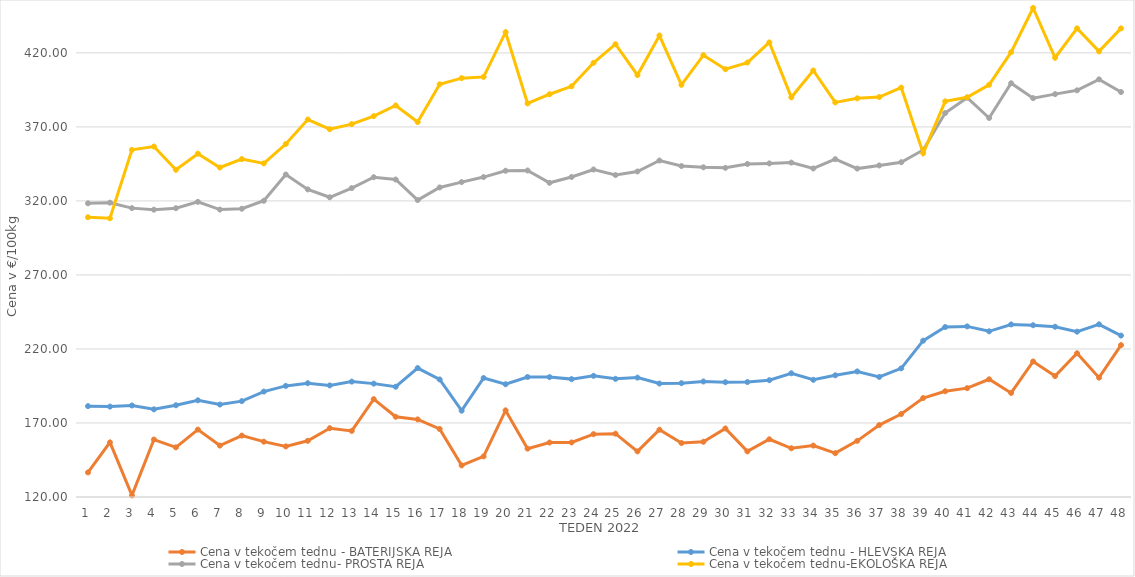
| Category | Cena v tekočem tednu - BATERIJSKA REJA | Cena v tekočem tednu - HLEVSKA REJA | Cena v tekočem tednu- PROSTA REJA | Cena v tekočem tednu-EKOLOŠKA REJA |
|---|---|---|---|---|
| 1.0 | 136.59 | 181.38 | 318.4 | 308.97 |
| 2.0 | 156.88 | 181.07 | 318.82 | 308.28 |
| 3.0 | 121.07 | 181.83 | 315.14 | 354.48 |
| 4.0 | 158.82 | 179.22 | 314.08 | 356.72 |
| 5.0 | 153.55 | 181.96 | 315.1 | 341.03 |
| 6.0 | 165.51 | 185.31 | 319.38 | 351.9 |
| 7.0 | 154.74 | 182.45 | 314.16 | 342.59 |
| 8.0 | 161.48 | 184.77 | 314.71 | 348.28 |
| 9.0 | 157.38 | 191.21 | 320.1 | 345.35 |
| 10.0 | 154.16 | 195.04 | 337.83 | 358.45 |
| 11.0 | 157.96 | 196.88 | 327.79 | 375 |
| 12.0 | 166.49 | 195.36 | 322.46 | 368.45 |
| 13.0 | 164.66 | 197.95 | 328.67 | 371.9 |
| 14.0 | 186.11 | 196.59 | 336.02 | 377.24 |
| 15.0 | 174.18 | 194.49 | 334.46 | 384.48 |
| 16.0 | 172.42 | 207.1 | 320.58 | 373.28 |
| 17.0 | 165.96 | 199.41 | 329.11 | 398.79 |
| 18.0 | 141.36 | 178.29 | 332.71 | 402.93 |
| 19.0 | 147.43 | 200.37 | 336.11 | 403.79 |
| 20.0 | 178.51 | 196.16 | 340.4 | 433.97 |
| 21.0 | 152.67 | 201.05 | 340.55 | 385.86 |
| 22.0 | 156.8 | 200.98 | 332.23 | 392.07 |
| 23.0 | 156.84 | 199.63 | 336.16 | 397.41 |
| 24.0 | 162.44 | 201.86 | 341.24 | 413.28 |
| 25.0 | 162.78 | 199.81 | 337.48 | 425.86 |
| 26.0 | 150.82 | 200.65 | 339.9 | 405 |
| 27.0 | 165.45 | 196.64 | 347.3 | 431.72 |
| 28.0 | 156.46 | 196.88 | 343.56 | 398.45 |
| 29.0 | 157.31 | 198.03 | 342.71 | 418.45 |
| 30.0 | 166.29 | 197.55 | 342.35 | 408.97 |
| 31.0 | 150.81 | 197.66 | 344.97 | 413.45 |
| 32.0 | 158.99 | 198.9 | 345.35 | 427.07 |
| 33.0 | 152.91 | 203.57 | 345.9 | 390 |
| 34.0 | 154.73 | 199.17 | 341.92 | 408.1 |
| 35.0 | 149.6 | 202.21 | 348.2 | 386.55 |
| 36.0 | 157.93 | 204.81 | 341.85 | 389.31 |
| 37.0 | 168.61 | 201.11 | 343.97 | 390.17 |
| 38.0 | 176.07 | 206.91 | 346.16 | 396.55 |
| 39.0 | 186.86 | 225.6 | 354.41 | 352.24 |
| 40.0 | 191.45 | 234.79 | 379.35 | 387.24 |
| 41.0 | 193.52 | 235.24 | 389.75 | 390 |
| 42.0 | 199.51 | 231.92 | 376.02 | 398.45 |
| 43.0 | 190.28 | 236.56 | 399.51 | 420.52 |
| 44.0 | 211.53 | 236.04 | 389.44 | 450.35 |
| 45.0 | 201.69 | 235.01 | 392.15 | 416.72 |
| 46.0 | 217.08 | 231.68 | 394.71 | 436.55 |
| 47.0 | 200.62 | 236.65 | 402.12 | 421.03 |
| 48.0 | 222.61 | 229.05 | 393.56 | 436.55 |